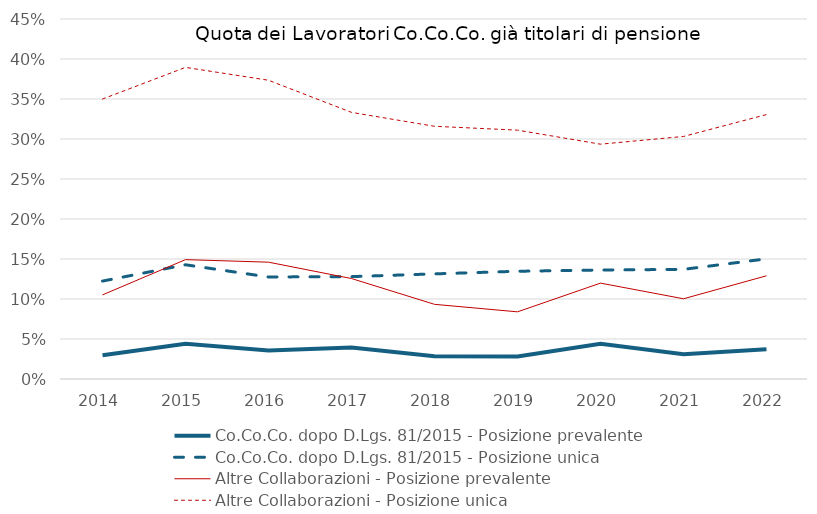
| Category | Co.Co.Co. dopo D.Lgs. 81/2015 | Altre Collaborazioni |
|---|---|---|
| 2014.0 | 0.122 | 0.35 |
| 2015.0 | 0.143 | 0.39 |
| 2016.0 | 0.128 | 0.373 |
| 2017.0 | 0.128 | 0.333 |
| 2018.0 | 0.131 | 0.316 |
| 2019.0 | 0.135 | 0.311 |
| 2020.0 | 0.136 | 0.294 |
| 2021.0 | 0.137 | 0.303 |
| 2022.0 | 0.15 | 0.331 |